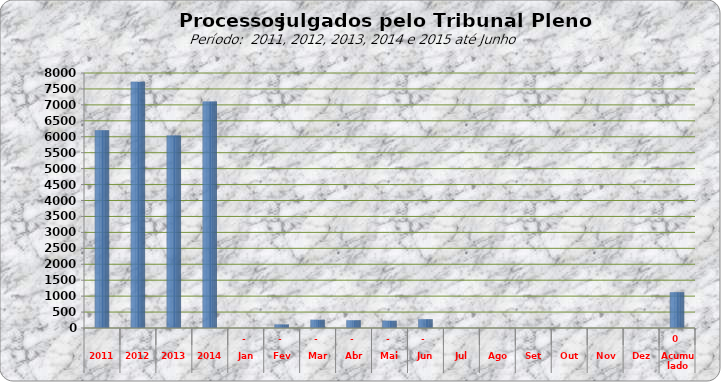
| Category | 6205 7722 6043  7.108  0 113 258 243 231 277 0 0 0 0 0 0 |
|---|---|
| 2011 | 6205 |
| 2012 | 7722 |
| 2013 | 6043 |
| 2014 | 7108 |
| Jan | 0 |
| Fev | 113 |
| Mar | 258 |
| Abr | 243 |
| Mai | 231 |
| Jun | 277 |
| Jul | 0 |
| Ago | 0 |
| Set | 0 |
| Out | 0 |
| Nov | 0 |
| Dez | 0 |
| Acumulado | 1122 |